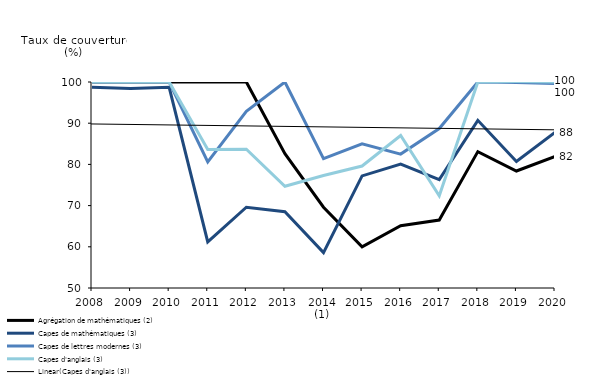
| Category | Agrégation de mathématiques (2) | Capes de mathématiques (3) | Capes de lettres modernes (3) | Capes d'anglais (3) |
|---|---|---|---|---|
| 2008 | 100 | 98.7 | 100 | 100 |
| 2009 | 100 | 98.4 | 100 | 100 |
| 2010 | 100 | 98.7 | 100 | 100 |
| 2011 | 100 | 61.2 | 80.6 | 83.6 |
| 2012 | 100 | 69.6 | 92.9 | 83.7 |
| 2013 | 82.6 | 68.5 | 100 | 74.7 |
| 2014 (1) | 69.6 | 58.6 | 81.4 | 77.3 |
| 2015 | 60 | 77.2 | 85 | 79.6 |
| 2016 | 65.1 | 80.1 | 82.5 | 87 |
| 2017 | 66.5 | 76.3 | 88.7 | 72.4 |
| 2018 | 83.1 | 90.7 | 100 | 100 |
| 2019 | 78.4 | 80.7 | 99.9 | 100.1 |
| 2020 | 81.9 | 87.8 | 99.6 | 100 |